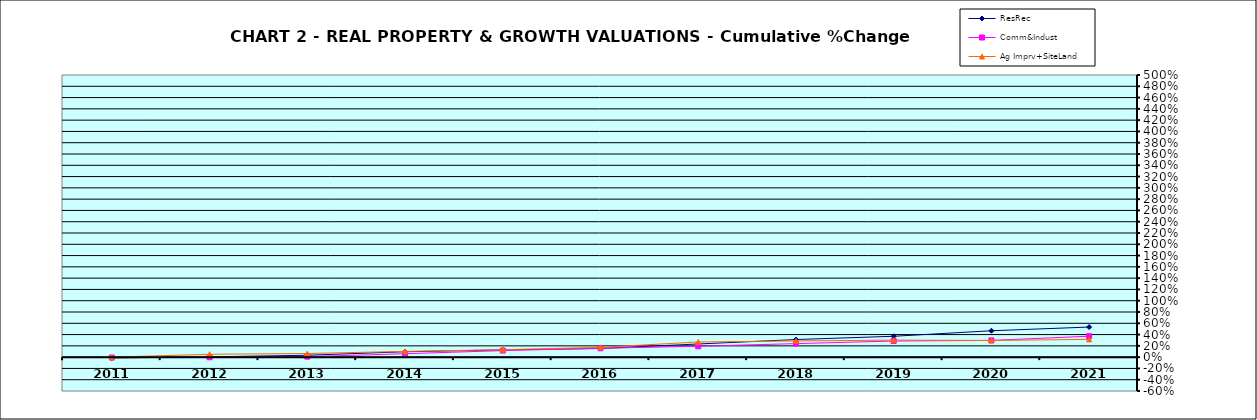
| Category | ResRec | Comm&Indust | Ag Imprv+SiteLand |
|---|---|---|---|
| 2011.0 | -0.014 | -0.007 | 0 |
| 2012.0 | 0.005 | -0.002 | 0.05 |
| 2013.0 | 0.033 | 0.009 | 0.064 |
| 2014.0 | 0.096 | 0.06 | 0.102 |
| 2015.0 | 0.128 | 0.116 | 0.131 |
| 2016.0 | 0.153 | 0.157 | 0.174 |
| 2017.0 | 0.233 | 0.193 | 0.269 |
| 2018.0 | 0.312 | 0.239 | 0.287 |
| 2019.0 | 0.37 | 0.286 | 0.302 |
| 2020.0 | 0.468 | 0.297 | 0.295 |
| 2021.0 | 0.533 | 0.371 | 0.315 |